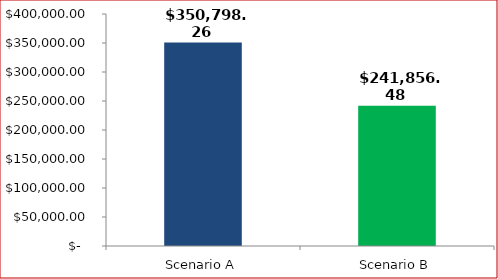
| Category | Lifetime Costs: |
|---|---|
| Scenario A | 350798.261 |
| Scenario B | 241856.482 |